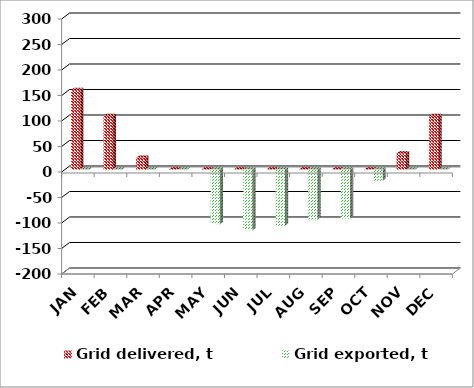
| Category | Grid delivered, t | Grid exported, t |
|---|---|---|
| JAN | 156 | 0 |
| FEB | 105 | 0 |
| MAR | 23 | 0 |
| APR | 0 | 0 |
| MAY | 0 | -107 |
| JUN | 0 | -119 |
| JUL | 0 | -110 |
| AUG | 0 | -98 |
| SEP | 0 | -96 |
| OCT | 0 | -22 |
| NOV | 32 | 0 |
| DEC | 105 | 0 |